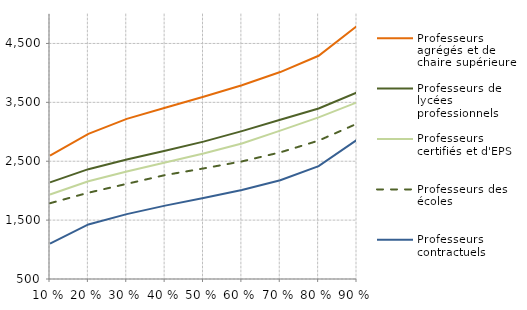
| Category | Professeurs agrégés et de chaire supérieure | Professeurs de lycées professionnels | Professeurs certifiés et d'EPS | Professeurs des écoles | Professeurs contractuels |
|---|---|---|---|---|---|
| 0.1 | 2593.05 | 2140.25 | 1933.883 | 1786.883 | 1099.099 |
| 0.2 | 2964.35 | 2365.133 | 2160.017 | 1965.217 | 1426.8 |
| 0.3 | 3219.633 | 2530.343 | 2325.683 | 2115.467 | 1601.281 |
| 0.4 | 3408.016 | 2676.976 | 2478.6 | 2264.883 | 1746.183 |
| 0.5 | 3593.5 | 2832.842 | 2629.652 | 2377.35 | 1874.502 |
| 0.6 | 3790.634 | 3010.94 | 2800.217 | 2496.85 | 2011.238 |
| 0.7 | 4014.102 | 3203.157 | 3020.05 | 2650.383 | 2176.376 |
| 0.8 | 4290.359 | 3395.35 | 3245.267 | 2850 | 2417.347 |
| 0.9 | 4797.619 | 3666.781 | 3499.679 | 3137.433 | 2864.504 |